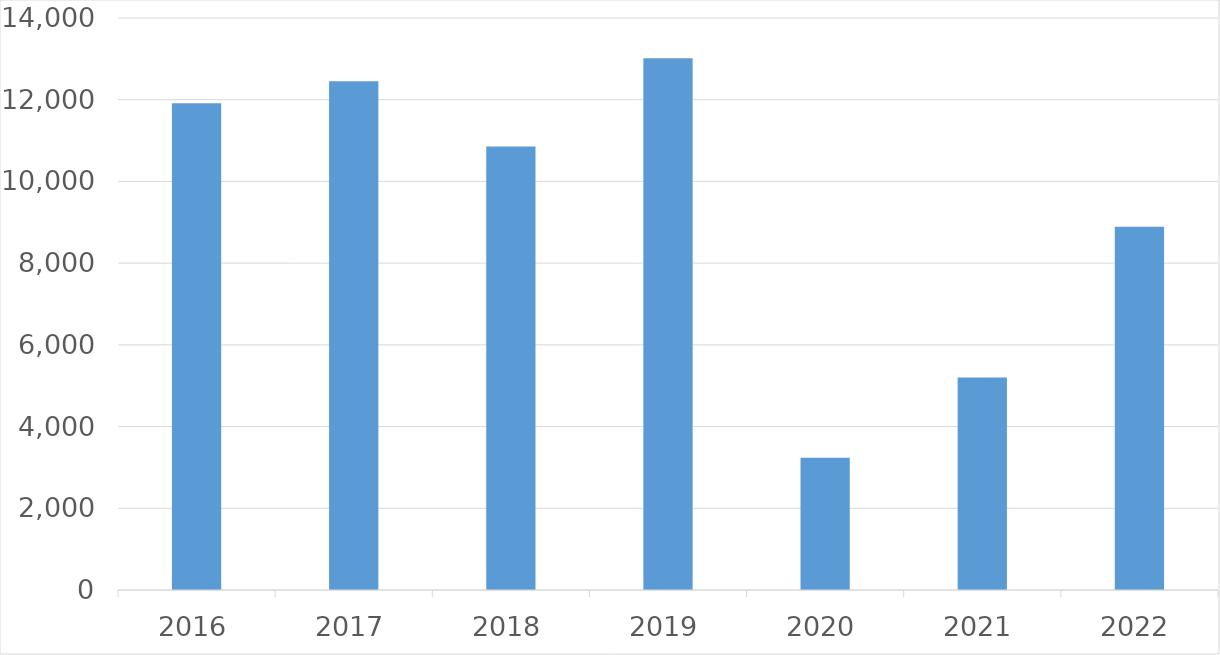
| Category | Series 0 |
|---|---|
| 2016 | 11913 |
| 2017 | 12454 |
| 2018 | 10856 |
| 2019 | 13014 |
| 2020 | 3234 |
| 2021 | 5199 |
| 2022 | 8888 |